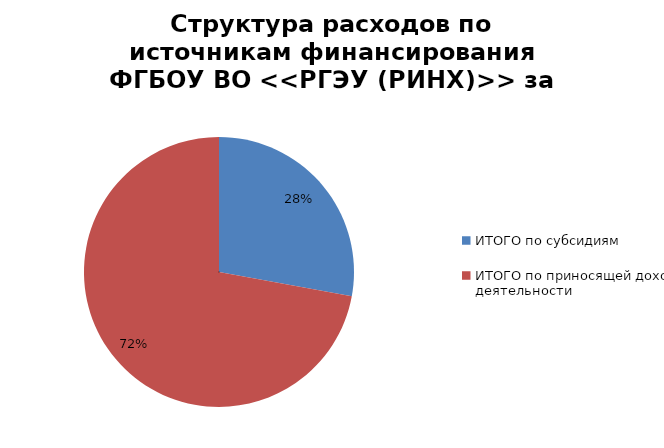
| Category | Series 0 |
|---|---|
| ИТОГО по субсидиям | 465315.4 |
| ИТОГО по приносящей доход деятельности | 1203557.8 |